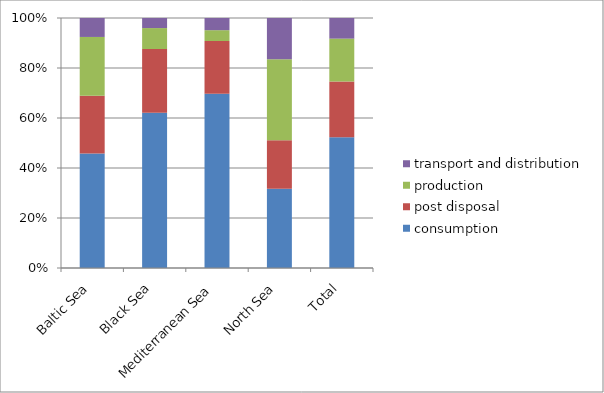
| Category | consumption | post disposal | production | transport and distribution |
|---|---|---|---|---|
| Baltic Sea | 0.458 | 0.23 | 0.236 | 0.076 |
| Black Sea | 0.621 | 0.255 | 0.084 | 0.04 |
| Mediterranean Sea | 0.697 | 0.212 | 0.043 | 0.049 |
| North Sea | 0.317 | 0.194 | 0.324 | 0.165 |
| Total | 2.093 | 0.891 | 0.686 | 0.33 |